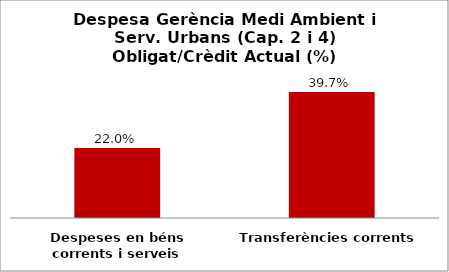
| Category | Series 0 |
|---|---|
| Despeses en béns corrents i serveis | 0.22 |
| Transferències corrents | 0.397 |